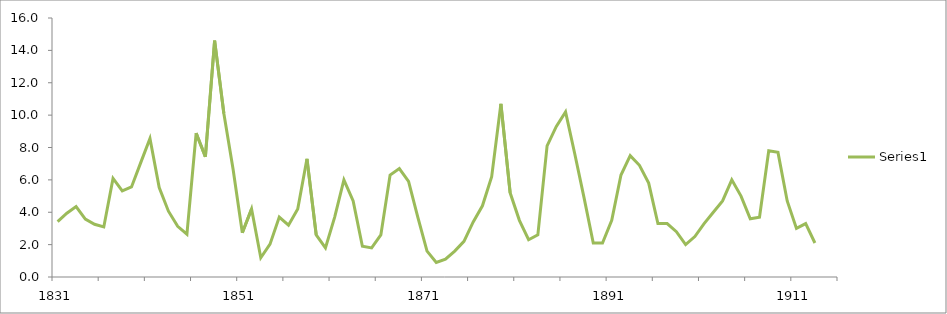
| Category | Series 1 | Series 2 |
|---|---|---|
| 1831.0 |  | 3.417 |
| 1832.0 |  | 3.944 |
| 1833.0 |  | 4.349 |
| 1834.0 |  | 3.579 |
| 1835.0 |  | 3.255 |
| 1836.0 |  | 3.093 |
| 1837.0 |  | 6.091 |
| 1838.0 |  | 5.322 |
| 1839.0 |  | 5.565 |
| 1840.0 |  | 7.064 |
| 1841.0 |  | 8.563 |
| 1842.0 |  | 5.524 |
| 1843.0 |  | 4.066 |
| 1844.0 |  | 3.134 |
| 1845.0 |  | 2.648 |
| 1846.0 |  | 8.887 |
| 1847.0 |  | 7.428 |
| 1848.0 |  | 14.6 |
| 1849.0 |  | 10.103 |
| 1850.0 |  | 6.659 |
| 1851.0 |  | 2.73 |
| 1852.0 |  | 4.2 |
| 1853.0 |  | 1.19 |
| 1854.0 |  | 2.03 |
| 1855.0 |  | 3.7 |
| 1856.0 |  | 3.2 |
| 1857.0 |  | 4.2 |
| 1858.0 |  | 7.3 |
| 1859.0 |  | 2.6 |
| 1860.0 |  | 1.8 |
| 1861.0 |  | 3.7 |
| 1862.0 |  | 6 |
| 1863.0 |  | 4.7 |
| 1864.0 |  | 1.9 |
| 1865.0 |  | 1.8 |
| 1866.0 |  | 2.6 |
| 1867.0 |  | 6.3 |
| 1868.0 |  | 6.7 |
| 1869.0 |  | 5.9 |
| 1870.0 |  | 3.7 |
| 1871.0 |  | 1.6 |
| 1872.0 |  | 0.9 |
| 1873.0 |  | 1.1 |
| 1874.0 |  | 1.6 |
| 1875.0 |  | 2.2 |
| 1876.0 |  | 3.4 |
| 1877.0 |  | 4.4 |
| 1878.0 |  | 6.2 |
| 1879.0 |  | 10.7 |
| 1880.0 |  | 5.2 |
| 1881.0 |  | 3.5 |
| 1882.0 |  | 2.3 |
| 1883.0 |  | 2.6 |
| 1884.0 |  | 8.1 |
| 1885.0 |  | 9.3 |
| 1886.0 |  | 10.2 |
| 1887.0 |  | 7.6 |
| 1888.0 |  | 4.9 |
| 1889.0 |  | 2.1 |
| 1890.0 |  | 2.1 |
| 1891.0 |  | 3.5 |
| 1892.0 |  | 6.3 |
| 1893.0 |  | 7.5 |
| 1894.0 |  | 6.9 |
| 1895.0 |  | 5.8 |
| 1896.0 |  | 3.3 |
| 1897.0 |  | 3.3 |
| 1898.0 |  | 2.8 |
| 1899.0 |  | 2 |
| 1900.0 |  | 2.5 |
| 1901.0 |  | 3.3 |
| 1902.0 |  | 4 |
| 1903.0 |  | 4.7 |
| 1904.0 |  | 6 |
| 1905.0 |  | 5 |
| 1906.0 |  | 3.6 |
| 1907.0 |  | 3.7 |
| 1908.0 |  | 7.8 |
| 1909.0 |  | 7.7 |
| 1910.0 |  | 4.7 |
| 1911.0 |  | 3 |
| 1912.0 |  | 3.3 |
| 1913.0 |  | 2.1 |